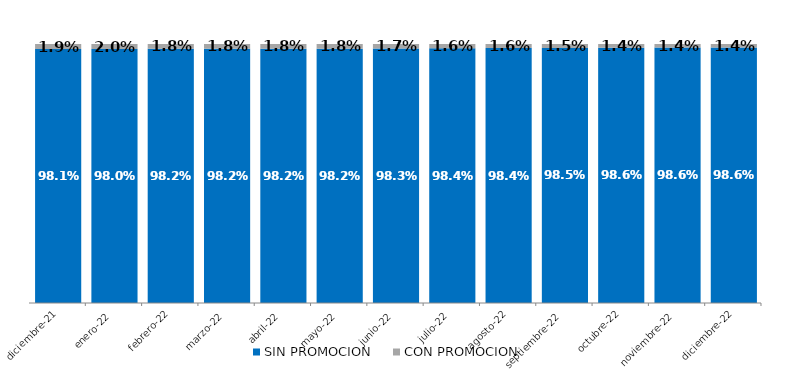
| Category | SIN PROMOCION   | CON PROMOCION   |
|---|---|---|
| 2021-12-01 | 0.981 | 0.019 |
| 2022-01-01 | 0.98 | 0.02 |
| 2022-02-01 | 0.982 | 0.018 |
| 2022-03-01 | 0.982 | 0.018 |
| 2022-04-01 | 0.982 | 0.018 |
| 2022-05-01 | 0.982 | 0.018 |
| 2022-06-01 | 0.983 | 0.017 |
| 2022-07-01 | 0.984 | 0.016 |
| 2022-08-01 | 0.984 | 0.016 |
| 2022-09-01 | 0.985 | 0.015 |
| 2022-10-01 | 0.986 | 0.014 |
| 2022-11-01 | 0.986 | 0.014 |
| 2022-12-01 | 0.986 | 0.014 |